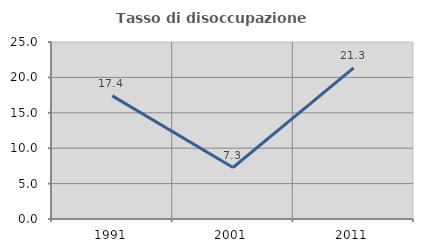
| Category | Tasso di disoccupazione giovanile  |
|---|---|
| 1991.0 | 17.391 |
| 2001.0 | 7.273 |
| 2011.0 | 21.333 |